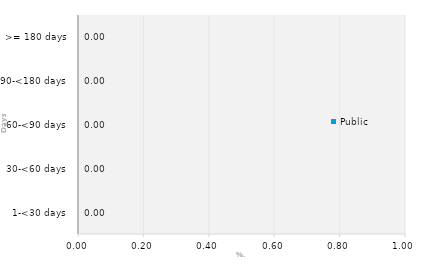
| Category | Public |
|---|---|
| 1-<30 days | 0 |
| 30-<60 days | 0 |
| 60-<90 days | 0 |
| 90-<180 days | 0 |
| >= 180 days | 0 |